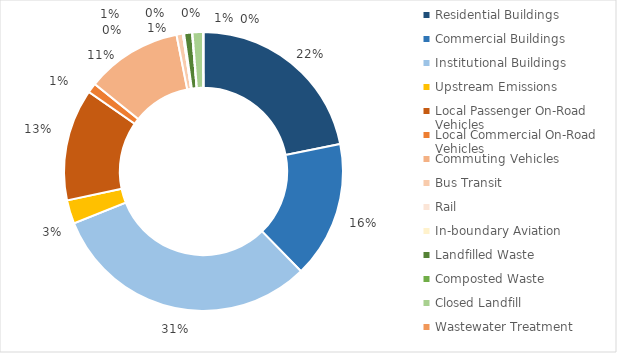
| Category | Series 0 |
|---|---|
| Residential Buildings | 367835.579 |
| Commercial Buildings | 266886.942 |
| Institutional Buildings | 526518.994 |
| Upstream Emissions | 46082.568 |
| Local Passenger On-Road Vehicles | 218520.479 |
| Local Commercial On-Road Vehicles | 18876.877 |
| Commuting Vehicles | 187213.962 |
| Bus Transit | 12410.341 |
| Rail | 135.545 |
| In-boundary Aviation | 2323.471 |
| Landfilled Waste | 15394.548 |
| Composted Waste | 825.034 |
| Closed Landfill | 20231 |
| Wastewater Treatment | 1013.867 |